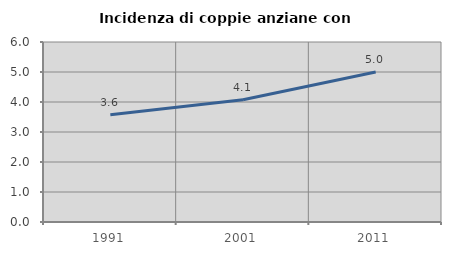
| Category | Incidenza di coppie anziane con figli |
|---|---|
| 1991.0 | 3.571 |
| 2001.0 | 4.075 |
| 2011.0 | 5 |